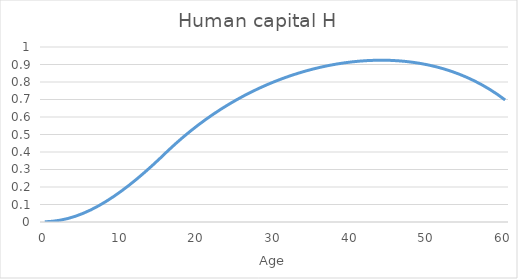
| Category | Human capital H |
|---|---|
| 0.0 | 0.001 |
| 1.0 | 0.004 |
| 2.0 | 0.01 |
| 3.0 | 0.02 |
| 4.0 | 0.033 |
| 5.0 | 0.05 |
| 6.0 | 0.069 |
| 7.0 | 0.092 |
| 8.0 | 0.118 |
| 9.0 | 0.147 |
| 10.0 | 0.177 |
| 11.0 | 0.211 |
| 12.0 | 0.246 |
| 13.0 | 0.283 |
| 14.0 | 0.322 |
| 15.0 | 0.363 |
| 16.0 | 0.405 |
| 17.0 | 0.446 |
| 18.0 | 0.484 |
| 19.0 | 0.52 |
| 20.0 | 0.554 |
| 21.0 | 0.587 |
| 22.0 | 0.617 |
| 23.0 | 0.646 |
| 24.0 | 0.673 |
| 25.0 | 0.698 |
| 26.0 | 0.722 |
| 27.0 | 0.745 |
| 28.0 | 0.766 |
| 29.0 | 0.785 |
| 30.0 | 0.803 |
| 31.0 | 0.82 |
| 32.0 | 0.836 |
| 33.0 | 0.85 |
| 34.0 | 0.863 |
| 35.0 | 0.875 |
| 36.0 | 0.885 |
| 37.0 | 0.894 |
| 38.0 | 0.902 |
| 39.0 | 0.909 |
| 40.0 | 0.915 |
| 41.0 | 0.919 |
| 42.0 | 0.922 |
| 43.0 | 0.924 |
| 44.0 | 0.925 |
| 45.0 | 0.924 |
| 46.0 | 0.921 |
| 47.0 | 0.918 |
| 48.0 | 0.912 |
| 49.0 | 0.906 |
| 50.0 | 0.897 |
| 51.0 | 0.887 |
| 52.0 | 0.875 |
| 53.0 | 0.861 |
| 54.0 | 0.845 |
| 55.0 | 0.827 |
| 56.0 | 0.806 |
| 57.0 | 0.783 |
| 58.0 | 0.757 |
| 59.0 | 0.729 |
| 60.0 | 0.697 |